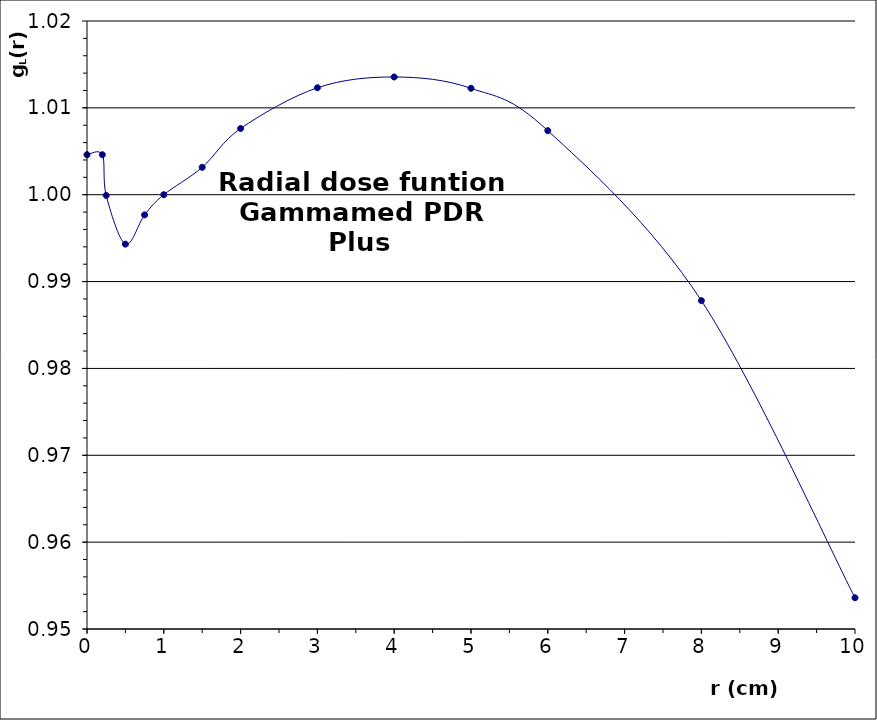
| Category | Series 0 |
|---|---|
| 0.0 | 1.005 |
| 0.2 | 1.005 |
| 0.25 | 1 |
| 0.5 | 0.994 |
| 0.75 | 0.998 |
| 1.0 | 1 |
| 1.5 | 1.003 |
| 2.0 | 1.008 |
| 3.0 | 1.012 |
| 4.0 | 1.014 |
| 5.0 | 1.012 |
| 6.0 | 1.007 |
| 8.0 | 0.988 |
| 10.0 | 0.954 |